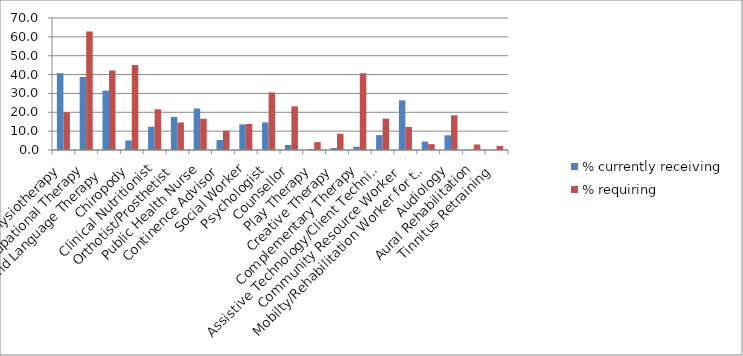
| Category | % currently receiving | % requiring |
|---|---|---|
| Physiotherapy | 40.742 | 20.096 |
| Occupational Therapy | 38.727 | 62.853 |
| Speech and Language Therapy | 31.492 | 42.178 |
| Chiropody | 5.046 | 45.049 |
| Clinical Nutritionist | 12.353 | 21.589 |
| Orthotist/Prosthetist | 17.471 | 14.586 |
| Public Health Nurse | 21.995 | 16.587 |
| Continence Advisor | 5.307 | 10.251 |
| Social Worker | 13.586 | 13.789 |
| Psychologist | 14.659 | 30.506 |
| Counsellor | 2.653 | 23.169 |
| Play Therapy | 0.565 | 4.176 |
| Creative Therapy | 1.073 | 8.583 |
| Complementary Therapy | 1.696 | 40.684 |
| Assistive Technology/Client Technical Service | 7.887 | 16.645 |
| Community Resource Worker | 26.33 | 12.223 |
| Mobilty/Rehabilitation Worker for the Blind | 4.466 | 3.103 |
| Audiology | 7.786 | 18.414 |
| Aural Rehabilitation | 0.232 | 2.914 |
| Tinnitus Retraining | 0.101 | 2.117 |